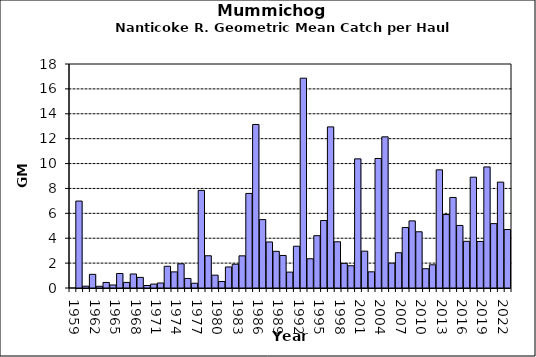
| Category | Series 0 |
|---|---|
| 1959.0 | 0 |
| 1960.0 | 6.987 |
| 1961.0 | 0.147 |
| 1962.0 | 1.098 |
| 1963.0 | 0.139 |
| 1964.0 | 0.447 |
| 1965.0 | 0.242 |
| 1966.0 | 1.164 |
| 1967.0 | 0.449 |
| 1968.0 | 1.125 |
| 1969.0 | 0.853 |
| 1970.0 | 0.2 |
| 1971.0 | 0.315 |
| 1972.0 | 0.403 |
| 1973.0 | 1.745 |
| 1974.0 | 1.295 |
| 1975.0 | 1.944 |
| 1976.0 | 0.767 |
| 1977.0 | 0.382 |
| 1978.0 | 7.845 |
| 1979.0 | 2.59 |
| 1980.0 | 1.032 |
| 1981.0 | 0.52 |
| 1982.0 | 1.692 |
| 1983.0 | 1.911 |
| 1984.0 | 2.585 |
| 1985.0 | 7.599 |
| 1986.0 | 13.14 |
| 1987.0 | 5.496 |
| 1988.0 | 3.7 |
| 1989.0 | 2.947 |
| 1990.0 | 2.614 |
| 1991.0 | 1.276 |
| 1992.0 | 3.357 |
| 1993.0 | 16.861 |
| 1994.0 | 2.349 |
| 1995.0 | 4.204 |
| 1996.0 | 5.425 |
| 1997.0 | 12.948 |
| 1998.0 | 3.714 |
| 1999.0 | 1.982 |
| 2000.0 | 1.789 |
| 2001.0 | 10.377 |
| 2002.0 | 2.962 |
| 2003.0 | 1.301 |
| 2004.0 | 10.41 |
| 2005.0 | 12.147 |
| 2006.0 | 1.999 |
| 2007.0 | 2.836 |
| 2008.0 | 4.858 |
| 2009.0 | 5.392 |
| 2010.0 | 4.518 |
| 2011.0 | 1.549 |
| 2012.0 | 1.864 |
| 2013.0 | 9.496 |
| 2014.0 | 5.903 |
| 2015.0 | 7.276 |
| 2016.0 | 5.028 |
| 2017.0 | 3.751 |
| 2018.0 | 8.905 |
| 2019.0 | 3.74 |
| 2020.0 | 9.73 |
| 2021.0 | 5.174 |
| 2022.0 | 8.506 |
| 2023.0 | 4.702 |